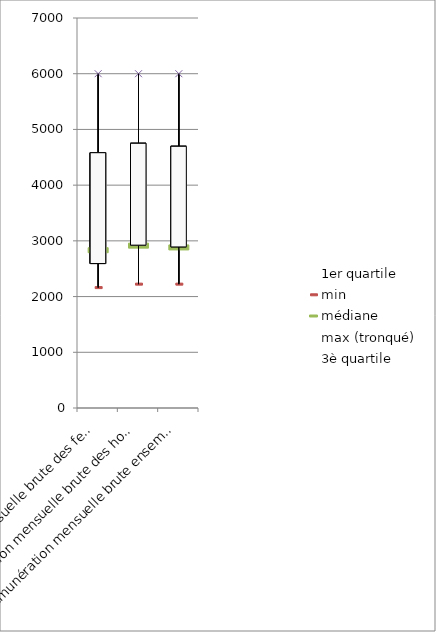
| Category | 1er quartile | min | médiane | max (tronqué) | 3è quartile |
|---|---|---|---|---|---|
| Rémunération mensuelle brute des femmes | 2593 | 2161 | 2841 | 6000 | 4582 |
| Rémunération mensuelle brute des hommes | 2923 | 2223 | 2923 | 6000 | 4751 |
| Rémunération mensuelle brute ensemble | 2891 | 2223 | 2891 | 6000 | 4697 |